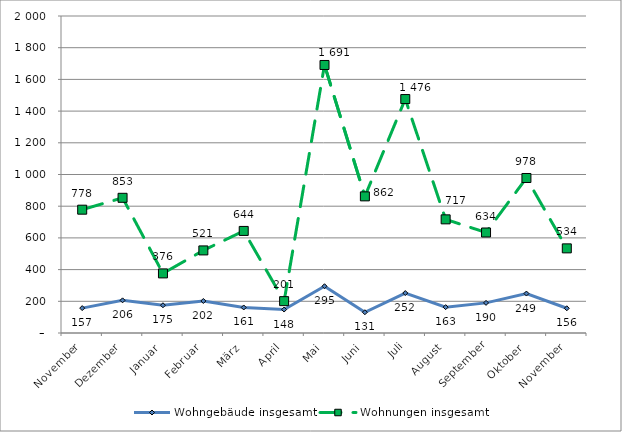
| Category | Wohngebäude insgesamt | Wohnungen insgesamt |
|---|---|---|
| November | 157 | 778 |
| Dezember | 206 | 853 |
| Januar | 175 | 376 |
| Februar | 202 | 521 |
| März | 161 | 644 |
| April | 148 | 201 |
| Mai | 295 | 1691 |
| Juni | 131 | 862 |
| Juli | 252 | 1476 |
| August | 163 | 717 |
| September | 190 | 634 |
| Oktober | 249 | 978 |
| November | 156 | 534 |